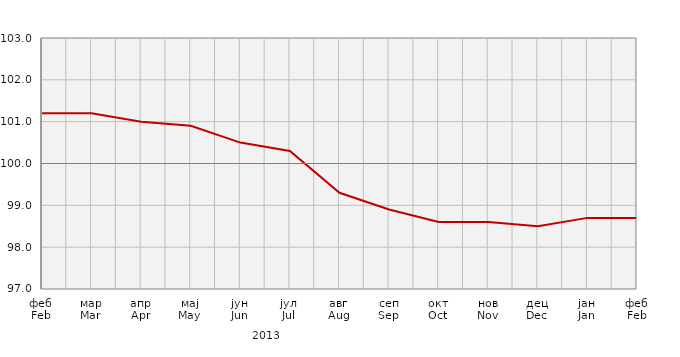
| Category | Индекси цијена произвођача
Producer price indices | Series 1 |
|---|---|---|
| феб
Feb | 101.2 |  |
| мар
Mar | 101.2 |  |
| апр
Apr | 101 |  |
| мај
May | 100.9 |  |
| јун
Jun | 100.5 |  |
| јул
Jul | 100.3 |  |
| авг
Aug | 99.3 |  |
| сеп
Sep | 98.9 |  |
| окт
Oct | 98.6 |  |
| нов
Nov | 98.6 |  |
| дец
Dec | 98.5 |  |
| јан
Jan | 98.7 |  |
| феб
Feb | 98.7 |  |